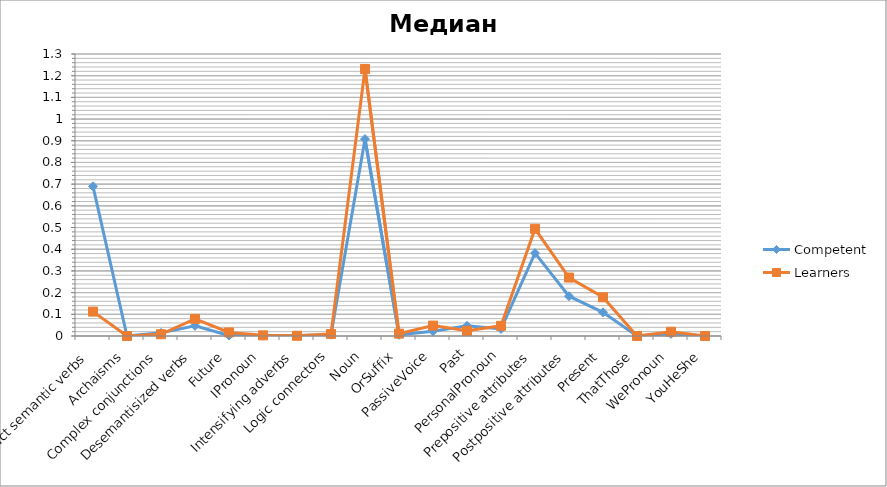
| Category | Competent | Learners |
|---|---|---|
| Abstract semantic verbs | 0.69 | 0.112 |
| Archaisms | 0 | 0 |
| Complex conjunctions | 0.014 | 0.008 |
| Desemantisized verbs | 0.047 | 0.079 |
| Future | 0.002 | 0.016 |
| IPronoun | 0.002 | 0.003 |
| Intensifying adverbs | 0.002 | 0.001 |
| Logic connectors | 0.006 | 0.01 |
| Noun | 0.908 | 1.231 |
| OrSuffix | 0.006 | 0.011 |
| PassiveVoice | 0.022 | 0.048 |
| Past | 0.047 | 0.024 |
| PersonalPronoun | 0.032 | 0.047 |
| Prepositive attributes | 0.382 | 0.494 |
| Postpositive attributes | 0.184 | 0.27 |
| Present | 0.109 | 0.178 |
| ThatThose | 0 | 0 |
| WePronoun | 0.01 | 0.02 |
| YouHeShe | 0 | 0 |